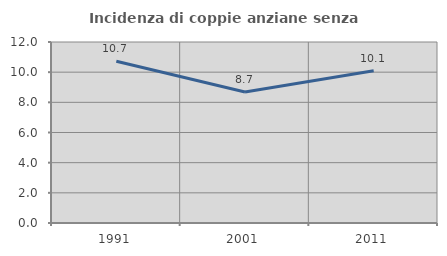
| Category | Incidenza di coppie anziane senza figli  |
|---|---|
| 1991.0 | 10.72 |
| 2001.0 | 8.685 |
| 2011.0 | 10.09 |